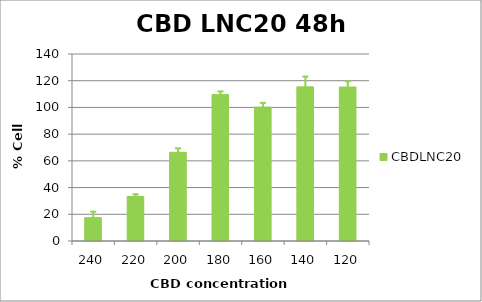
| Category | CBDLNC20 |
|---|---|
| 240.0 | 17.491 |
| 220.0 | 33.321 |
| 200.0 | 66.377 |
| 180.0 | 109.611 |
| 160.0 | 100.206 |
| 140.0 | 115.397 |
| 120.0 | 115.292 |